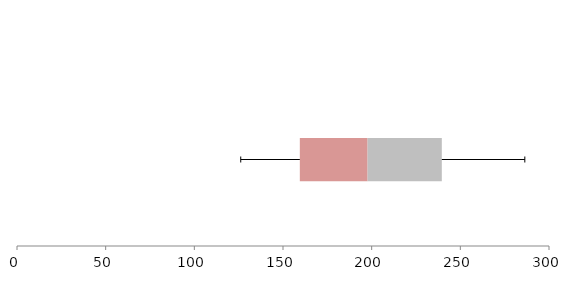
| Category | Series 1 | Series 2 | Series 3 |
|---|---|---|---|
| 0 | 159.49 | 38.218 | 41.852 |